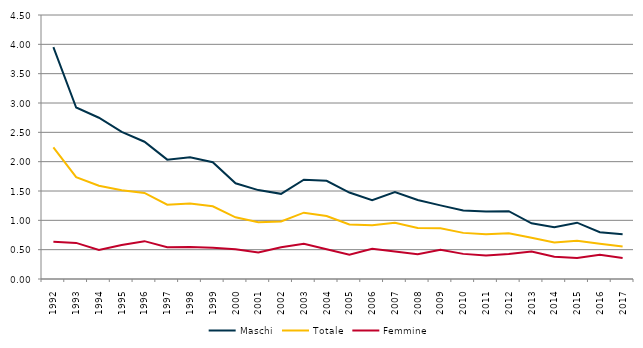
| Category | Maschi | Totale | Femmine |
|---|---|---|---|
| 1992 | 3.951 | 2.245 | 0.636 |
| 1993 | 2.923 | 1.735 | 0.615 |
| 1994 | 2.749 | 1.589 | 0.495 |
| 1995 | 2.507 | 1.515 | 0.581 |
| 1996 | 2.34 | 1.467 | 0.645 |
| 1997 | 2.035 | 1.266 | 0.542 |
| 1998 | 2.075 | 1.286 | 0.545 |
| 1999 | 1.992 | 1.239 | 0.531 |
| 2000 | 1.632 | 1.052 | 0.507 |
| 2001 | 1.515 | 0.967 | 0.452 |
| 2002 | 1.452 | 0.981 | 0.54 |
| 2003 | 1.694 | 1.131 | 0.602 |
| 2004 | 1.675 | 1.073 | 0.508 |
| 2005 | 1.474 | 0.928 | 0.415 |
| 2006 | 1.345 | 0.917 | 0.514 |
| 2007 | 1.48 | 0.958 | 0.468 |
| 2008 | 1.348 | 0.87 | 0.422 |
| 2009 | 1.255 | 0.865 | 0.499 |
| 2010 | 1.168 | 0.786 | 0.428 |
| 2011 | 1.149 | 0.763 | 0.401 |
| 2012 | 1.156 | 0.779 | 0.426 |
| 2013 | 0.949 | 0.702 | 0.47 |
| 2014 | 0.882 | 0.623 | 0.38 |
| 2015 | 0.96 | 0.65 | 0.358 |
| 2016 | 0.798 | 0.6 | 0.414 |
| 2017 | 0.761 | 0.553 | 0.357 |